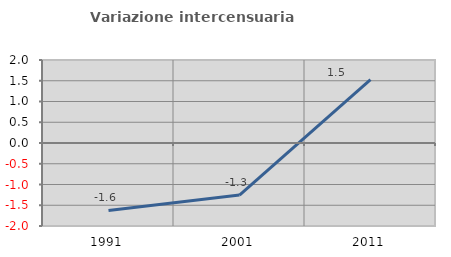
| Category | Variazione intercensuaria annua |
|---|---|
| 1991.0 | -1.625 |
| 2001.0 | -1.255 |
| 2011.0 | 1.526 |